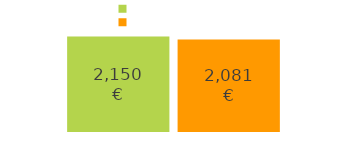
| Category | sisse tulev | välja minev |
|---|---|---|
| sisse tulev raha: | 2150 | 2081 |